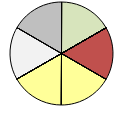
| Category | Series 1 |
|---|---|
| + + | 0 |
| + | 1 |
| o | 0 |
| - | 0 |
| - - | 0 |
| + + | 0 |
| + | 0 |
| o | 0 |
| - | 0 |
| - - | 1 |
| + + | 0 |
| + | 0 |
| o | 1 |
| - | 0 |
| - - | 0 |
| + + | 0 |
| + | 0 |
| o | 1 |
| - | 0 |
| - - | 0 |
| * * | 0 |
| * | 0 |
| o | 1 |
| * * | 0 |
| * | 1 |
| o | 0 |